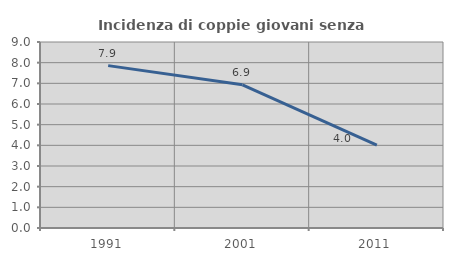
| Category | Incidenza di coppie giovani senza figli |
|---|---|
| 1991.0 | 7.856 |
| 2001.0 | 6.928 |
| 2011.0 | 4.006 |